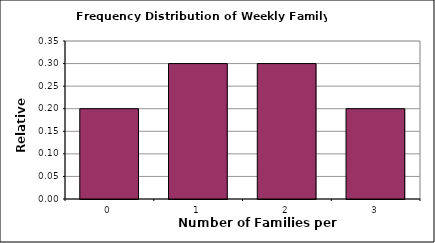
| Category | Relative frequency |
|---|---|
| 0.0 | 0.2 |
| 1.0 | 0.3 |
| 2.0 | 0.3 |
| 3.0 | 0.2 |